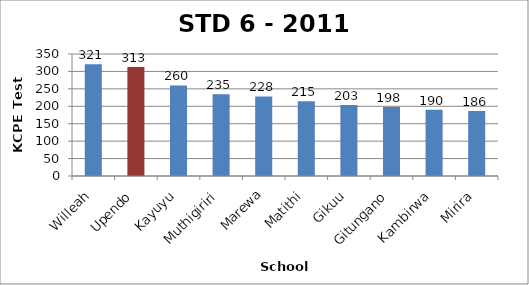
| Category | STD 6 Total Score |
|---|---|
| Willeah | 320.6 |
| Upendo | 312.81 |
| Kayuyu | 259.91 |
| Muthigiriri | 234.72 |
| Marewa | 228.22 |
| Matithi | 214.69 |
| Gikuu | 203.37 |
| Gitungano | 197.88 |
| Kambirwa | 189.86 |
| Mirira | 186.45 |